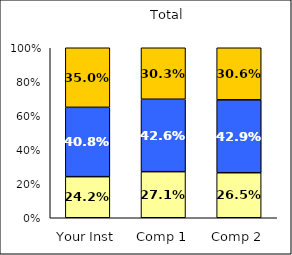
| Category | Low Scholarly Productivity | Average Scholarly Productivity | High Scholarly Productivity |
|---|---|---|---|
| Your Inst | 0.242 | 0.408 | 0.35 |
| Comp 1 | 0.271 | 0.426 | 0.303 |
| Comp 2 | 0.265 | 0.429 | 0.306 |